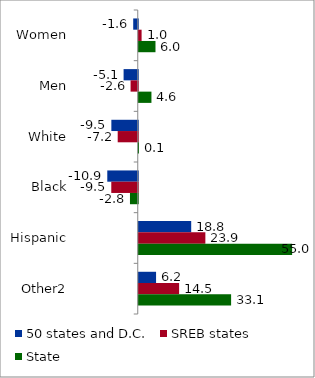
| Category | 50 states and D.C. | SREB states | State |
|---|---|---|---|
| Women | -1.628 | 1.022 | 6.003 |
| Men | -5.08 | -2.575 | 4.553 |
| White | -9.469 | -7.193 | 0.086 |
| Black | -10.931 | -9.496 | -2.794 |
| Hispanic | 18.817 | 23.898 | 55.023 |
| Other2 | 6.212 | 14.484 | 33.132 |